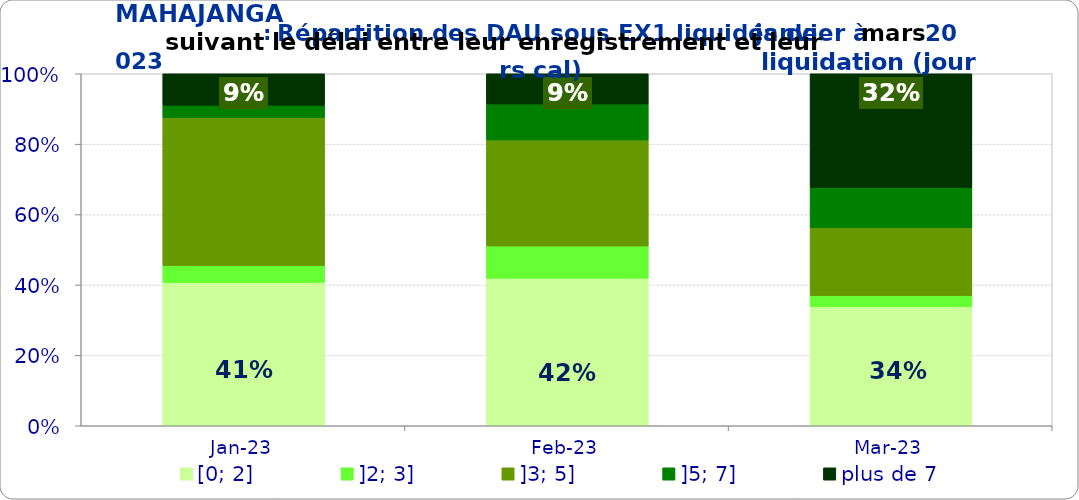
| Category | [0; 2] | ]2; 3] | ]3; 5] | ]5; 7] | plus de 7 |
|---|---|---|---|---|---|
| 2023-01-01 | 0.407 | 0.048 | 0.421 | 0.034 | 0.09 |
| 2023-02-01 | 0.419 | 0.091 | 0.301 | 0.102 | 0.086 |
| 2023-03-01 | 0.339 | 0.031 | 0.193 | 0.115 | 0.323 |